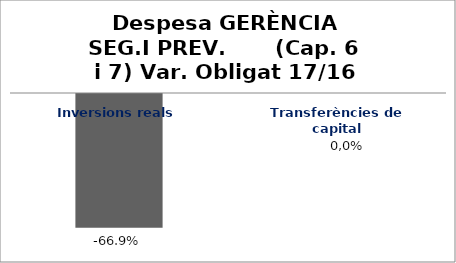
| Category | Series 0 |
|---|---|
| Inversions reals | -0.669 |
| Transferències de capital | 0 |